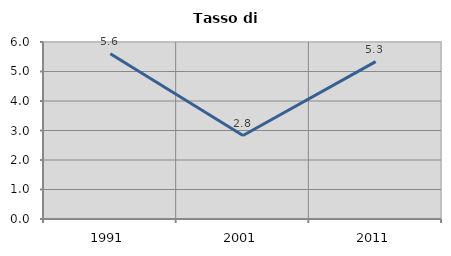
| Category | Tasso di disoccupazione   |
|---|---|
| 1991.0 | 5.599 |
| 2001.0 | 2.829 |
| 2011.0 | 5.336 |